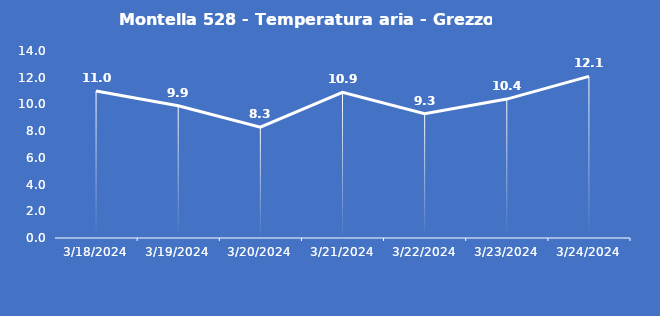
| Category | Montella 528 - Temperatura aria - Grezzo (°C) |
|---|---|
| 3/18/24 | 11 |
| 3/19/24 | 9.9 |
| 3/20/24 | 8.3 |
| 3/21/24 | 10.9 |
| 3/22/24 | 9.3 |
| 3/23/24 | 10.4 |
| 3/24/24 | 12.1 |